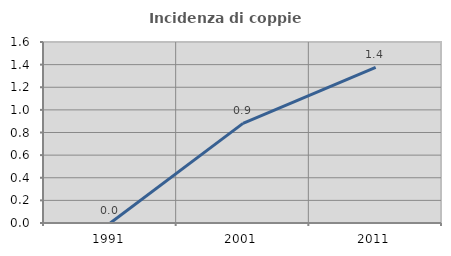
| Category | Incidenza di coppie miste |
|---|---|
| 1991.0 | 0 |
| 2001.0 | 0.881 |
| 2011.0 | 1.376 |